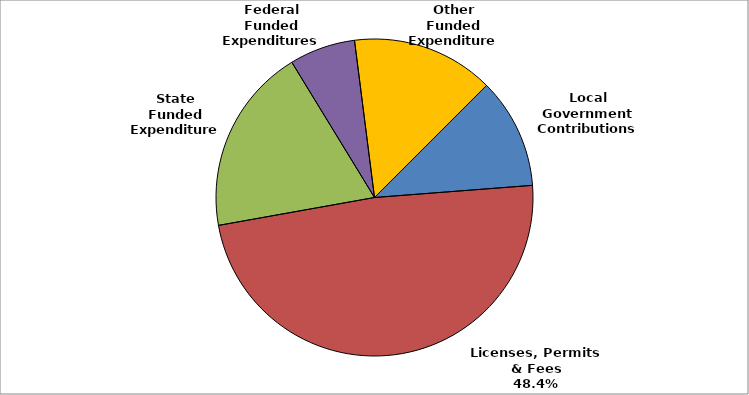
| Category | Series 0 |
|---|---|
| Local Government Contributions | 0.113 |
| Licenses, Permits & Fees | 0.484 |
| State Funded Expenditures | 0.191 |
| Federal Funded Expenditures | 0.067 |
| Other Funded Expenditures | 0.145 |